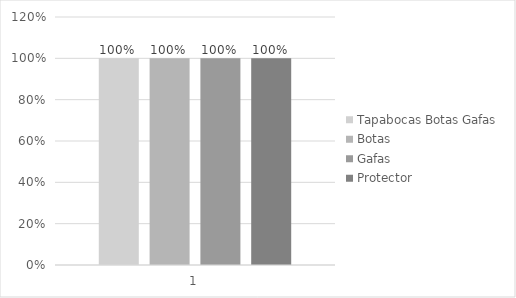
| Category | Tapabocas Botas Gafas | Botas | Gafas | Protector |
|---|---|---|---|---|
| 0 | 1 | 1 | 1 | 1 |